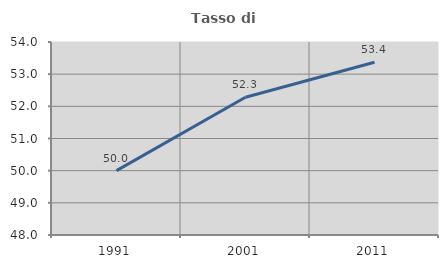
| Category | Tasso di occupazione   |
|---|---|
| 1991.0 | 50 |
| 2001.0 | 52.282 |
| 2011.0 | 53.369 |